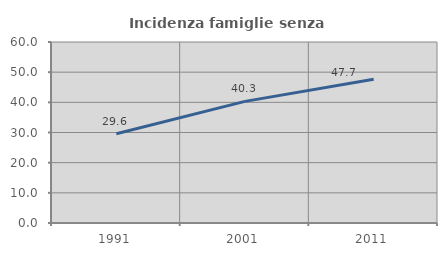
| Category | Incidenza famiglie senza nuclei |
|---|---|
| 1991.0 | 29.586 |
| 2001.0 | 40.323 |
| 2011.0 | 47.664 |